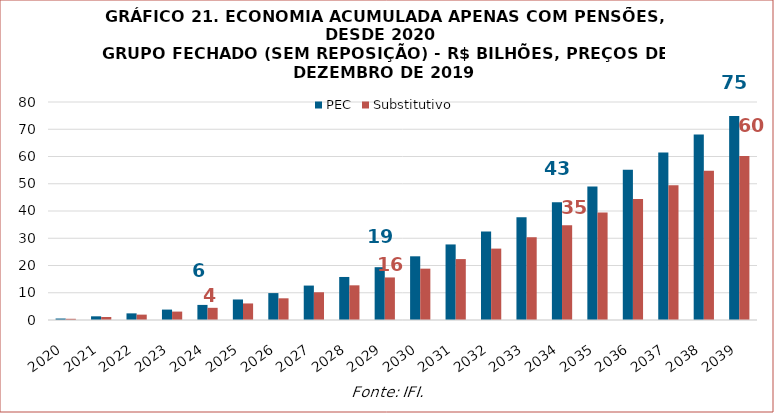
| Category | PEC | Substitutivo |
|---|---|---|
| 2020.0 | 543219423.409 | 440923031.455 |
| 2021.0 | 1352630002.063 | 1096559446.219 |
| 2022.0 | 2435505545.27 | 1970898855.361 |
| 2023.0 | 3821470073.181 | 3087459041.524 |
| 2024.0 | 5537504064.619 | 4469072604.764 |
| 2025.0 | 7531576332.497 | 6073937508.096 |
| 2026.0 | 9876053026.162 | 7961247403.997 |
| 2027.0 | 12634189323.592 | 10182147126.306 |
| 2028.0 | 15793839735.81 | 12726676784.326 |
| 2029.0 | 19377086382.601 | 15614627286.212 |
| 2030.0 | 23376354527.571 | 18841609224.416 |
| 2031.0 | 27728482783.334 | 22351643943.525 |
| 2032.0 | 32505185706.347 | 26201110400.422 |
| 2033.0 | 37686926795.829 | 30374086871.762 |
| 2034.0 | 43176827632.521 | 34791628876.994 |
| 2035.0 | 48983933825.735 | 39453399094.405 |
| 2036.0 | 55107636598.324 | 44360267678.06 |
| 2037.0 | 61496244211.228 | 49473524389.921 |
| 2038.0 | 68107318512.336 | 54757126863.04 |
| 2039.0 | 74876018434.092 | 60157840703.853 |